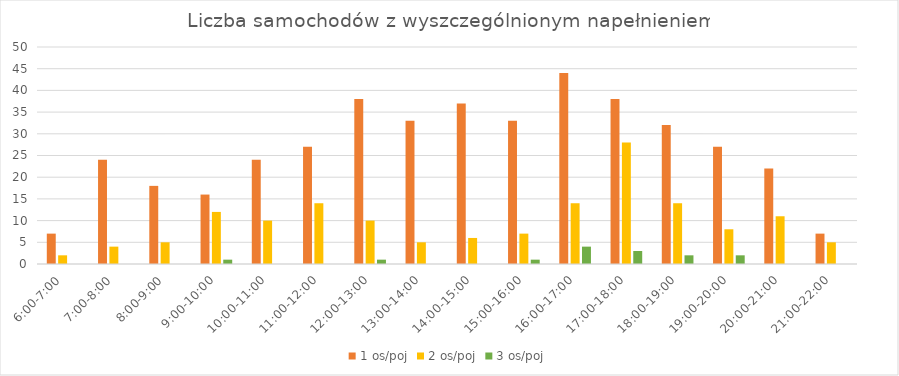
| Category | 1 os/poj | 2 os/poj | 3 os/poj |
|---|---|---|---|
| 6:00-7:00 | 7 | 2 | 0 |
| 7:00-8:00 | 24 | 4 | 0 |
| 8:00-9:00 | 18 | 5 | 0 |
| 9:00-10:00 | 16 | 12 | 1 |
| 10:00-11:00 | 24 | 10 | 0 |
| 11:00-12:00 | 27 | 14 | 0 |
| 12:00-13:00 | 38 | 10 | 1 |
| 13:00-14:00 | 33 | 5 | 0 |
| 14:00-15:00 | 37 | 6 | 0 |
| 15:00-16:00 | 33 | 7 | 1 |
| 16:00-17:00 | 44 | 14 | 4 |
| 17:00-18:00 | 38 | 28 | 3 |
| 18:00-19:00 | 32 | 14 | 2 |
| 19:00-20:00 | 27 | 8 | 2 |
| 20:00-21:00 | 22 | 11 | 0 |
| 21:00-22:00 | 7 | 5 | 0 |